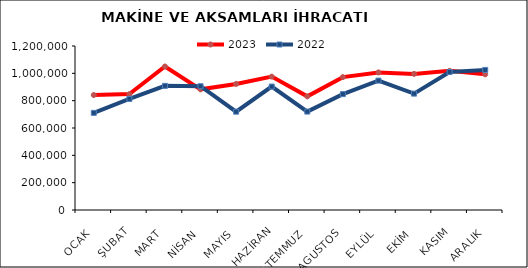
| Category | 2023 | 2022 |
|---|---|---|
| OCAK | 841196.85 | 710623.132 |
| ŞUBAT | 847880.976 | 812964.407 |
| MART | 1050187.853 | 908444.95 |
| NİSAN | 882967.952 | 905617.862 |
| MAYIS | 922539.206 | 719443.063 |
| HAZİRAN | 976098.705 | 903199.896 |
| TEMMUZ | 831436.518 | 720125.869 |
| AGUSTOS | 972190.379 | 847900.019 |
| EYLÜL | 1006637.542 | 946727.587 |
| EKİM | 995989.496 | 851497.613 |
| KASIM | 1017984.612 | 1010023.239 |
| ARALIK | 992646.386 | 1024921.288 |